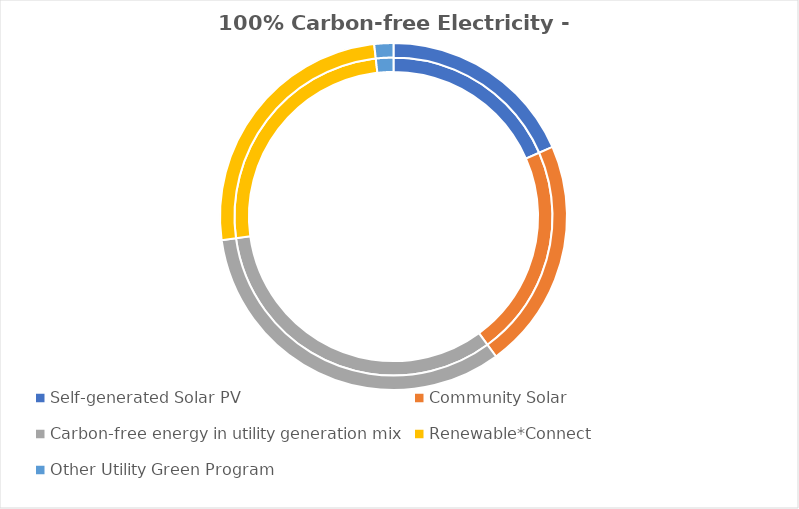
| Category | Series 0 | Series 1 | Series 2 |
|---|---|---|---|
| Self-generated Solar PV |  | 179271 | 0.184 |
| Community Solar |  | 209100 | 0.215 |
| Carbon-free energy in utility generation mix |  | 319792.96 | 0.329 |
| Renewable*Connect |  | 246978.16 | 0.254 |
| Other Utility Green Program |  | 17280.88 | 0.018 |